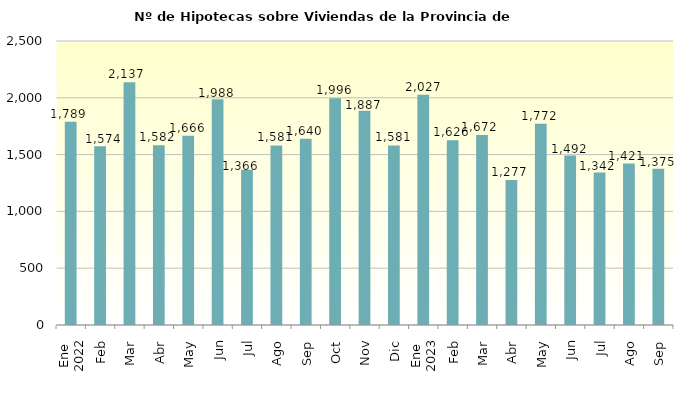
| Category | Series 0 |
|---|---|
| 0 | 1789 |
| 1 | 1574 |
| 2 | 2137 |
| 3 | 1582 |
| 4 | 1666 |
| 5 | 1988 |
| 6 | 1366 |
| 7 | 1581 |
| 8 | 1640 |
| 9 | 1996 |
| 10 | 1887 |
| 11 | 1581 |
| 12 | 2027 |
| 13 | 1626 |
| 14 | 1672 |
| 15 | 1277 |
| 16 | 1772 |
| 17 | 1492 |
| 18 | 1342 |
| 19 | 1421 |
| 20 | 1375 |